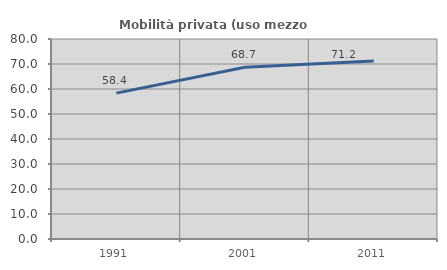
| Category | Mobilità privata (uso mezzo privato) |
|---|---|
| 1991.0 | 58.361 |
| 2001.0 | 68.698 |
| 2011.0 | 71.198 |